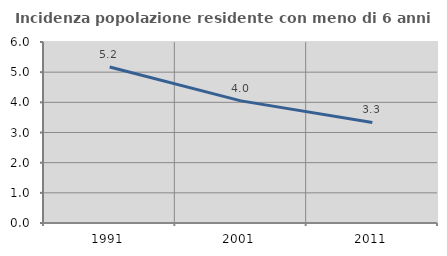
| Category | Incidenza popolazione residente con meno di 6 anni |
|---|---|
| 1991.0 | 5.172 |
| 2001.0 | 4.049 |
| 2011.0 | 3.333 |